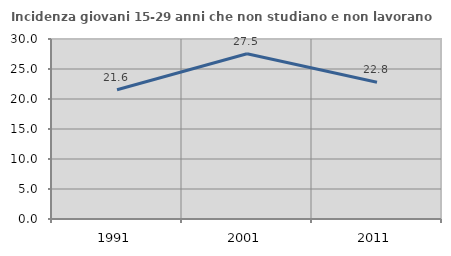
| Category | Incidenza giovani 15-29 anni che non studiano e non lavorano  |
|---|---|
| 1991.0 | 21.55 |
| 2001.0 | 27.542 |
| 2011.0 | 22.784 |